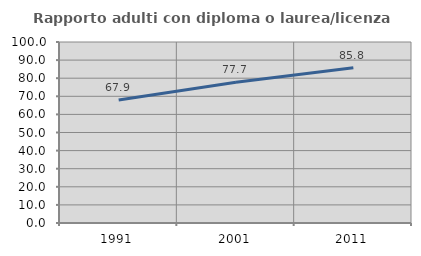
| Category | Rapporto adulti con diploma o laurea/licenza media  |
|---|---|
| 1991.0 | 67.9 |
| 2001.0 | 77.732 |
| 2011.0 | 85.822 |